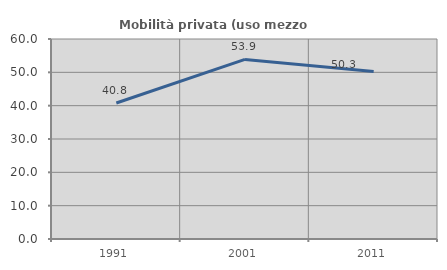
| Category | Mobilità privata (uso mezzo privato) |
|---|---|
| 1991.0 | 40.79 |
| 2001.0 | 53.883 |
| 2011.0 | 50.272 |